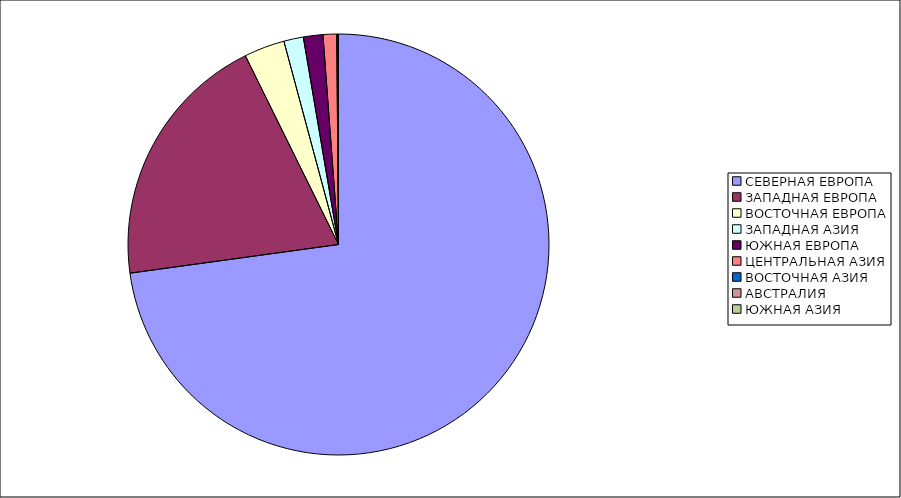
| Category | Оборот |
|---|---|
| СЕВЕРНАЯ ЕВРОПА | 72.824 |
| ЗАПАДНАЯ ЕВРОПА | 19.879 |
| ВОСТОЧНАЯ ЕВРОПА | 3.118 |
| ЗАПАДНАЯ АЗИЯ | 1.502 |
| ЮЖНАЯ ЕВРОПА | 1.498 |
| ЦЕНТРАЛЬНАЯ АЗИЯ | 1.047 |
| ВОСТОЧНАЯ АЗИЯ | 0.1 |
| АВСТРАЛИЯ | 0.031 |
| ЮЖНАЯ АЗИЯ | 0 |